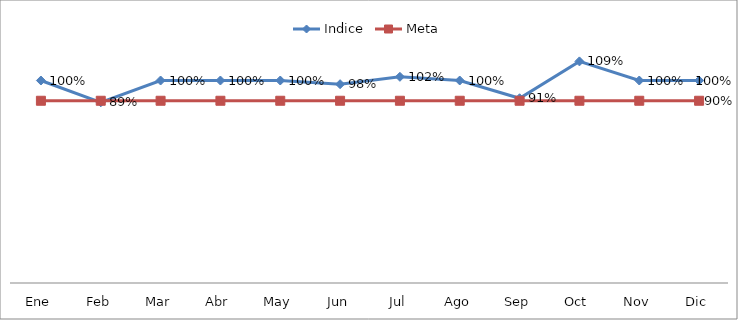
| Category | Indice | Meta |
|---|---|---|
| Ene | 1 | 0.9 |
| Feb | 0.892 | 0.9 |
| Mar | 1 | 0.9 |
| Abr | 1 | 0.9 |
| May | 1 | 0.9 |
| Jun | 0.982 | 0.9 |
| Jul | 1.018 | 0.9 |
| Ago | 1 | 0.9 |
| Sep | 0.912 | 0.9 |
| Oct | 1.094 | 0.9 |
| Nov | 1 | 0.9 |
| Dic | 1 | 0.9 |